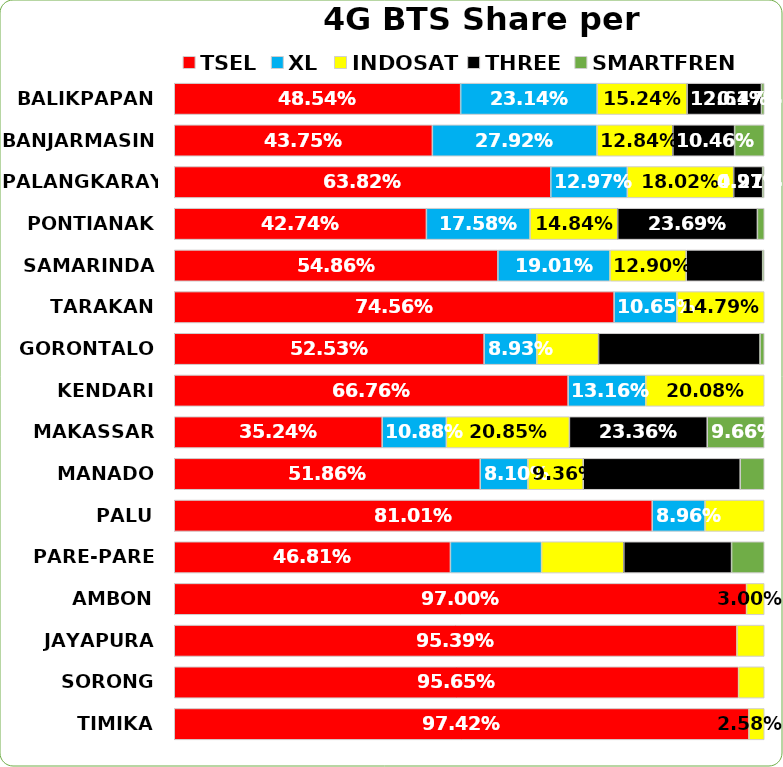
| Category | TSEL | XL | INDOSAT | THREE | SMARTFREN |
|---|---|---|---|---|---|
| BALIKPAPAN | 0.485 | 0.231 | 0.152 | 0.126 | 0.005 |
| BANJARMASIN | 0.437 | 0.279 | 0.128 | 0.105 | 0.05 |
| PALANGKARAYA | 0.638 | 0.13 | 0.18 | 0.049 | 0.003 |
| PONTIANAK | 0.427 | 0.176 | 0.148 | 0.237 | 0.012 |
| SAMARINDA | 0.549 | 0.19 | 0.129 | 0.13 | 0.003 |
| TARAKAN | 0.746 | 0.107 | 0.148 | 0 | 0 |
| GORONTALO | 0.525 | 0.089 | 0.105 | 0.274 | 0.007 |
| KENDARI | 0.668 | 0.132 | 0.201 | 0 | 0 |
| MAKASSAR | 0.352 | 0.109 | 0.209 | 0.234 | 0.097 |
| MANADO | 0.519 | 0.081 | 0.094 | 0.266 | 0.041 |
| PALU | 0.81 | 0.09 | 0.1 | 0 | 0 |
| PARE-PARE | 0.468 | 0.155 | 0.139 | 0.183 | 0.055 |
| AMBON | 0.97 | 0 | 0.03 | 0 | 0 |
| JAYAPURA | 0.954 | 0 | 0.046 | 0 | 0 |
| SORONG | 0.957 | 0 | 0.043 | 0 | 0 |
| TIMIKA | 0.974 | 0 | 0.026 | 0 | 0 |